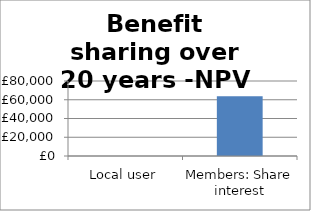
| Category | Series 0 |
|---|---|
| Local user | 0 |
| Members: Share interest | 63672.764 |